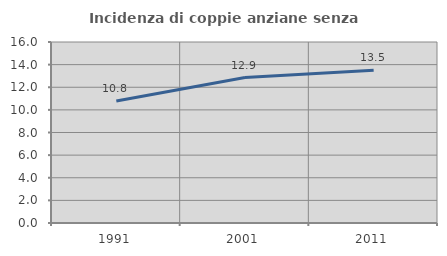
| Category | Incidenza di coppie anziane senza figli  |
|---|---|
| 1991.0 | 10.783 |
| 2001.0 | 12.855 |
| 2011.0 | 13.5 |